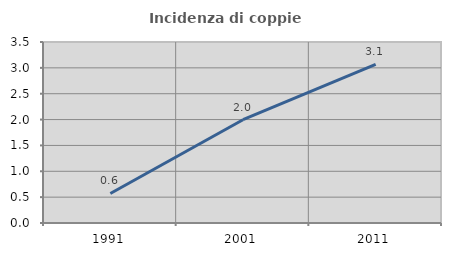
| Category | Incidenza di coppie miste |
|---|---|
| 1991.0 | 0.57 |
| 2001.0 | 1.997 |
| 2011.0 | 3.065 |